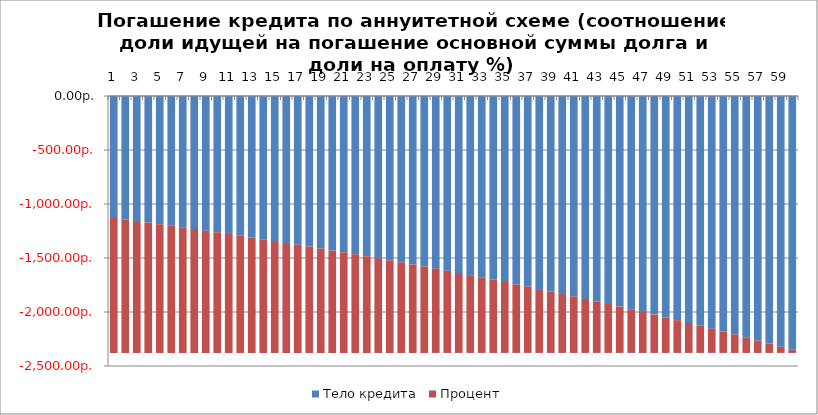
| Category | Тело кредита | Процент |
|---|---|---|
| 0 | -1128.993 | -1250 |
| 1 | -1143.105 | -1235.888 |
| 2 | -1157.394 | -1221.599 |
| 3 | -1171.862 | -1207.131 |
| 4 | -1186.51 | -1192.483 |
| 5 | -1201.341 | -1177.652 |
| 6 | -1216.358 | -1162.635 |
| 7 | -1231.563 | -1147.43 |
| 8 | -1246.957 | -1132.036 |
| 9 | -1262.544 | -1116.449 |
| 10 | -1278.326 | -1100.667 |
| 11 | -1294.305 | -1084.688 |
| 12 | -1310.484 | -1068.509 |
| 13 | -1326.865 | -1052.128 |
| 14 | -1343.451 | -1035.542 |
| 15 | -1360.244 | -1018.749 |
| 16 | -1377.247 | -1001.746 |
| 17 | -1394.462 | -984.531 |
| 18 | -1411.893 | -967.1 |
| 19 | -1429.542 | -949.451 |
| 20 | -1447.411 | -931.582 |
| 21 | -1465.504 | -913.489 |
| 22 | -1483.823 | -895.171 |
| 23 | -1502.37 | -876.623 |
| 24 | -1521.15 | -857.843 |
| 25 | -1540.164 | -838.829 |
| 26 | -1559.416 | -819.577 |
| 27 | -1578.909 | -800.084 |
| 28 | -1598.645 | -780.348 |
| 29 | -1618.628 | -760.365 |
| 30 | -1638.861 | -740.132 |
| 31 | -1659.347 | -719.646 |
| 32 | -1680.089 | -698.904 |
| 33 | -1701.09 | -677.903 |
| 34 | -1722.354 | -656.639 |
| 35 | -1743.883 | -635.11 |
| 36 | -1765.682 | -613.311 |
| 37 | -1787.753 | -591.24 |
| 38 | -1810.1 | -568.893 |
| 39 | -1832.726 | -546.267 |
| 40 | -1855.635 | -523.358 |
| 41 | -1878.83 | -500.163 |
| 42 | -1902.316 | -476.677 |
| 43 | -1926.095 | -452.898 |
| 44 | -1950.171 | -428.822 |
| 45 | -1974.548 | -404.445 |
| 46 | -1999.23 | -379.763 |
| 47 | -2024.22 | -354.773 |
| 48 | -2049.523 | -329.47 |
| 49 | -2075.142 | -303.851 |
| 50 | -2101.081 | -277.912 |
| 51 | -2127.345 | -251.648 |
| 52 | -2153.937 | -225.056 |
| 53 | -2180.861 | -198.132 |
| 54 | -2208.122 | -170.871 |
| 55 | -2235.723 | -143.27 |
| 56 | -2263.67 | -115.323 |
| 57 | -2291.965 | -87.028 |
| 58 | -2320.615 | -58.378 |
| 59 | -2349.623 | -29.37 |